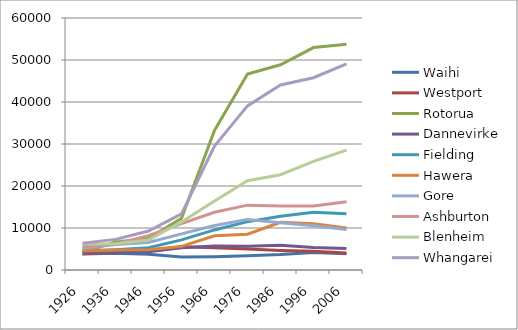
| Category | Waihi | Westport | Rotorua | Dannevirke | Fielding | Hawera | Gore | Ashburton | Blenheim | Whangarei |
|---|---|---|---|---|---|---|---|---|---|---|
| 1926.0 | 3782.329 | 3888.047 | 4211.746 | 4275.801 | 4532.798 | 4592.893 | 5146.69 | 5522.83 | 6212.169 | 6384.863 |
| 1936.0 | 3984.826 | 4265.186 | 6645.787 | 4417.858 | 4843.643 | 4758.201 | 6093.208 | 6177.179 | 6274.465 | 7287.67 |
| 1946.0 | 3756 | 4686 | 7512 | 4334 | 5284.153 | 4840 | 6544.682 | 8195.221 | 7160.595 | 9289 |
| 1956.0 | 3075 | 5522 | 12302 | 5294 | 7168.106 | 5620 | 8595.786 | 11045.638 | 11421.026 | 13363 |
| 1966.0 | 3169 | 5271 | 33229 | 5728 | 9542.329 | 8142 | 10607.621 | 13754.946 | 16404.949 | 29503 |
| 1976.0 | 3415 | 4988 | 46650 | 5638 | 11509.755 | 8506 | 12014.728 | 15440.665 | 21253.836 | 39069 |
| 1986.0 | 3679 | 4660 | 48855 | 5873 | 12802 | 11375 | 11249 | 15229 | 22681 | 44043 |
| 1996.0 | 4177.703 | 4440.674 | 52956 | 5343.958 | 13758.166 | 10983.722 | 10546.124 | 15244.367 | 25875 | 45785 |
| 2006.0 | 3895.579 | 4053.469 | 53766 | 5123.523 | 13389.448 | 9977.58 | 9622.854 | 16240.169 | 28527 | 49080 |